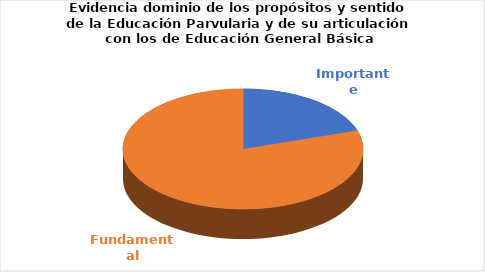
| Category | Series 0 |
|---|---|
| Importante | 3 |
| Fundamental | 12 |